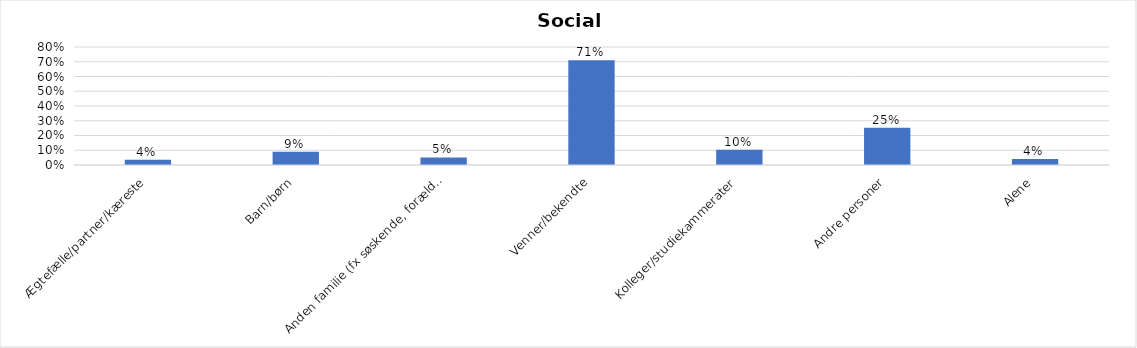
| Category | % |
|---|---|
| Ægtefælle/partner/kæreste | 0.036 |
| Barn/børn | 0.09 |
| Anden familie (fx søskende, forældre) | 0.051 |
| Venner/bekendte | 0.71 |
| Kolleger/studiekammerater | 0.103 |
| Andre personer | 0.253 |
| Alene | 0.041 |